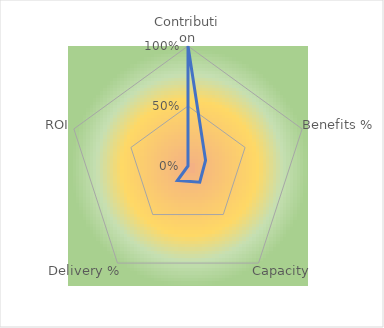
| Category | Series 0 |
|---|---|
| Contribution | 1 |
| Benefits % | 0.154 |
| Capacity | 0.167 |
| Delivery % | 0.15 |
| ROI | 0 |